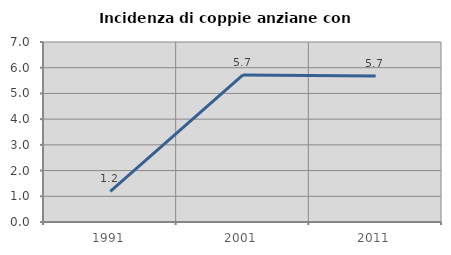
| Category | Incidenza di coppie anziane con figli |
|---|---|
| 1991.0 | 1.188 |
| 2001.0 | 5.721 |
| 2011.0 | 5.682 |